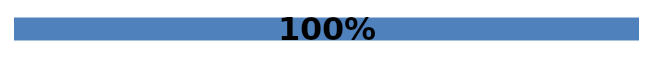
| Category | Series 0 | Series 1 | Series 2 |
|---|---|---|---|
| 0 | 1 | 0 | 0 |